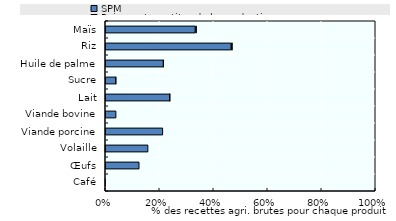
| Category | SPM | Paiements au titre de la production | Autres transferts au titre d'un seul produit |
|---|---|---|---|
| Café | 0 | 0 | 0 |
| Œufs | 0.126 | 0 | 0 |
| Volaille | 0.159 | 0 | 0 |
| Viande porcine | 0.213 | 0 | 0 |
| Viande bovine | 0.04 | 0 | 0 |
| Lait | 0.239 | 0 | 0.001 |
| Sucre | 0.04 | 0 | 0 |
| Huile de palme | 0.216 | 0 | 0 |
| Riz | 0.466 | 0.004 | 0 |
| Maïs | 0.334 | 0 | 0.005 |